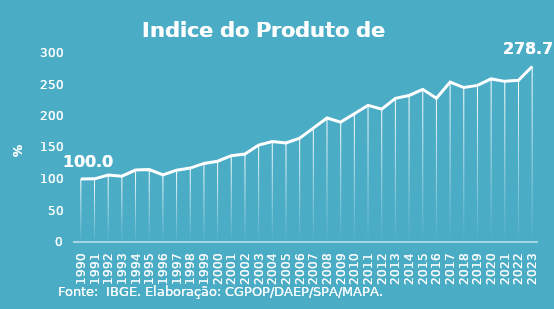
| Category | Indice de Prod. base 1990 |
|---|---|
| 1990.0 | 100 |
| 1991.0 | 100.275 |
| 1992.0 | 106.203 |
| 1993.0 | 104.57 |
| 1994.0 | 114.164 |
| 1995.0 | 115.024 |
| 1996.0 | 106.552 |
| 1997.0 | 114.037 |
| 1998.0 | 117.319 |
| 1999.0 | 124.734 |
| 2000.0 | 128.293 |
| 2001.0 | 136.975 |
| 2002.0 | 139.51 |
| 2003.0 | 153.868 |
| 2004.0 | 159.641 |
| 2005.0 | 157.136 |
| 2006.0 | 164.858 |
| 2007.0 | 180.781 |
| 2008.0 | 196.91 |
| 2009.0 | 190.309 |
| 2010.0 | 203.581 |
| 2011.0 | 217.041 |
| 2012.0 | 210.932 |
| 2013.0 | 228.009 |
| 2014.0 | 232.562 |
| 2015.0 | 242.318 |
| 2016.0 | 228.239 |
| 2017.0 | 253.826 |
| 2018.0 | 245.134 |
| 2019.0 | 248.619 |
| 2020.0 | 258.848 |
| 2021.0 | 254.988 |
| 2022.0 | 256.751 |
| 2023.0 | 278.659 |